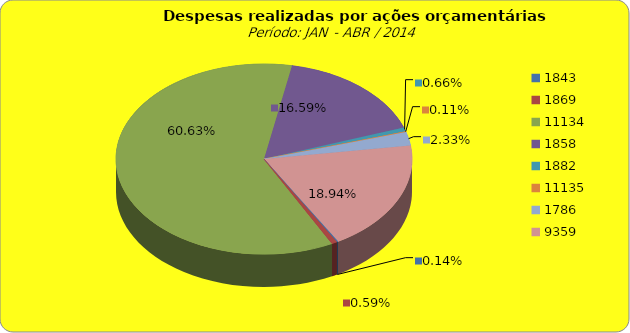
| Category | Series 1 |
|---|---|
| 1843.0 | 100000 |
| 1869.0 | 411082.12 |
| 11134.0 | 42189768.25 |
| 1858.0 | 11542868.49 |
| 1882.0 | 460659.2 |
| 11135.0 | 79056.75 |
| 1786.0 | 1624742.18 |
| 9359.0 | 13178289.21 |